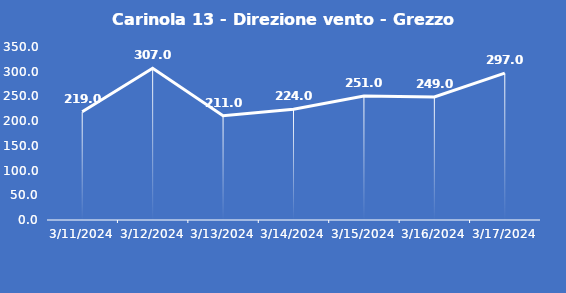
| Category | Carinola 13 - Direzione vento - Grezzo (°N) |
|---|---|
| 3/11/24 | 219 |
| 3/12/24 | 307 |
| 3/13/24 | 211 |
| 3/14/24 | 224 |
| 3/15/24 | 251 |
| 3/16/24 | 249 |
| 3/17/24 | 297 |